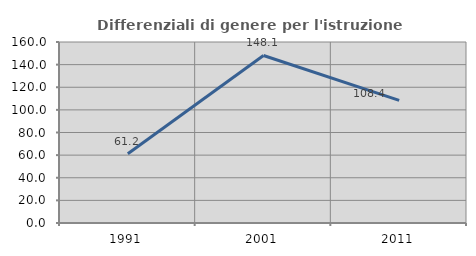
| Category | Differenziali di genere per l'istruzione superiore |
|---|---|
| 1991.0 | 61.176 |
| 2001.0 | 148.08 |
| 2011.0 | 108.366 |